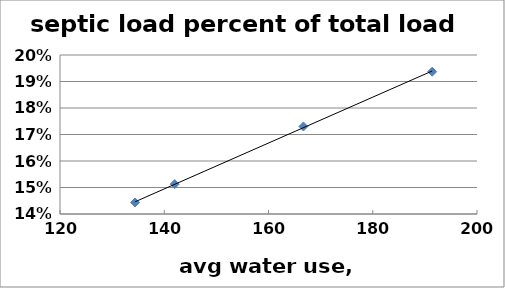
| Category | septic load |
|---|---|
| 166.7 | 0.173 |
| 134.4 | 0.144 |
| 142.0 | 0.151 |
| 191.4 | 0.194 |